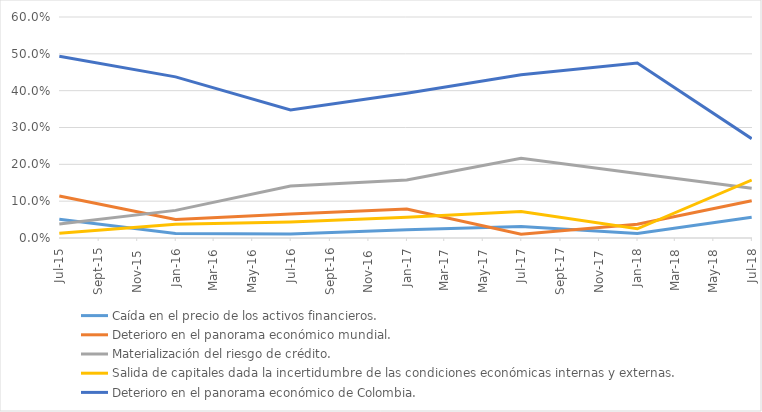
| Category | Caída en el precio de los activos financieros. | Deterioro en el panorama económico mundial. | Materialización del riesgo de crédito. | Salida de capitales dada la incertidumbre de las condiciones económicas internas y externas. | Deterioro en el panorama económico de Colombia. |
|---|---|---|---|---|---|
| 2015-07-01 | 0.051 | 0.114 | 0.038 | 0.013 | 0.494 |
| 2016-01-01 | 0.012 | 0.05 | 0.075 | 0.038 | 0.438 |
| 2016-07-01 | 0.011 | 0.065 | 0.141 | 0.043 | 0.348 |
| 2017-01-01 | 0.022 | 0.079 | 0.157 | 0.056 | 0.393 |
| 2017-07-01 | 0.031 | 0.01 | 0.216 | 0.072 | 0.443 |
| 2018-01-01 | 0.012 | 0.038 | 0.175 | 0.025 | 0.475 |
| 2018-07-01 | 0.056 | 0.101 | 0.135 | 0.157 | 0.27 |